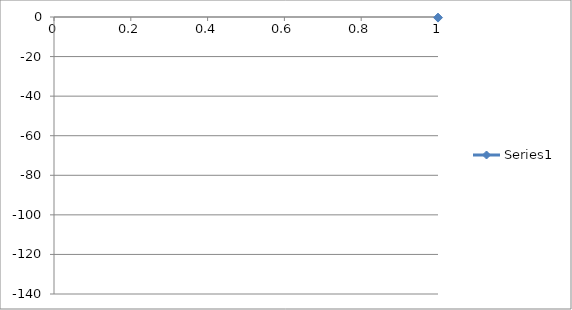
| Category | Series 0 |
|---|---|
| 0 | -0.308 |
| 1 | -0.345 |
| 2 | -0.391 |
| 3 | -0.426 |
| 4 | -0.462 |
| 5 | -0.481 |
| 6 | -0.52 |
| 7 | -0.547 |
| 8 | -0.577 |
| 9 | -0.63 |
| 10 | -0.69 |
| 11 | -0.733 |
| 12 | -0.781 |
| 13 | -0.852 |
| 14 | -0.932 |
| 15 | -1.025 |
| 16 | -1.119 |
| 17 | -1.239 |
| 18 | -1.372 |
| 19 | -1.512 |
| 20 | -1.696 |
| 21 | -1.873 |
| 22 | -2.105 |
| 23 | -2.351 |
| 24 | -2.673 |
| 25 | -3.03 |
| 26 | -3.458 |
| 27 | -4.013 |
| 28 | -4.698 |
| 29 | -6.071 |
| 30 | -6.754 |
| 31 | -7.737 |
| 32 | -8.215 |
| 33 | -8.807 |
| 34 | -9.493 |
| 35 | -10.876 |
| 36 | -11.461 |
| 37 | -13.031 |
| 38 | -14.277 |
| 39 | -15.553 |
| 40 | -17.068 |
| 41 | -18.646 |
| 42 | -20.546 |
| 43 | -22.472 |
| 44 | -25.158 |
| 45 | -27.834 |
| 46 | -30.607 |
| 47 | -33.442 |
| 48 | -36.999 |
| 49 | -40.371 |
| 50 | -44.378 |
| 51 | -48.425 |
| 52 | -52.546 |
| 53 | -56.638 |
| 54 | -61.38 |
| 55 | -65.673 |
| 56 | -69.777 |
| 57 | -74.334 |
| 58 | -78.542 |
| 59 | -82.749 |
| 60 | -86.443 |
| 61 | -90.438 |
| 62 | -93.694 |
| 63 | -96.607 |
| 64 | -99.52 |
| 65 | -102.029 |
| 66 | -103.824 |
| 67 | -105.673 |
| 68 | -107.474 |
| 69 | -108.966 |
| 70 | -110.3 |
| 71 | -110.897 |
| 72 | -111.976 |
| 73 | -112.696 |
| 74 | -113.047 |
| 75 | -113.39 |
| 76 | -113.764 |
| 77 | -113.999 |
| 78 | -114.204 |
| 79 | -114.363 |
| 80 | -114.504 |
| 81 | -114.608 |
| 82 | -114.692 |
| 83 | -114.741 |
| 84 | -114.739 |
| 85 | -114.674 |
| 86 | -114.531 |
| 87 | -114.293 |
| 88 | -113.894 |
| 89 | -113.36 |
| 90 | -112.061 |
| 91 | -111.465 |
| 92 | -109.879 |
| 93 | -108.36 |
| 94 | -106.556 |
| 95 | -104.025 |
| 96 | -101.44 |
| 97 | -98.7 |
| 98 | -95.771 |
| 99 | -92.507 |
| 100 | -88.64 |
| 101 | -84.805 |
| 102 | -80.417 |
| 103 | -76.396 |
| 104 | -71.609 |
| 105 | -67.262 |
| 106 | -62.924 |
| 107 | -58.123 |
| 108 | -53.976 |
| 109 | -49.637 |
| 110 | -45.465 |
| 111 | -41.634 |
| 112 | -38.272 |
| 113 | -34.392 |
| 114 | -31.455 |
| 115 | -28.705 |
| 116 | -25.849 |
| 117 | -23.486 |
| 118 | -21.717 |
| 119 | -19.282 |
| 120 | -17.804 |
| 121 | -16.225 |
| 122 | -14.72 |
| 123 | -13.358 |
| 124 | -12.725 |
| 125 | -11.332 |
| 126 | -10.733 |
| 127 | -9.439 |
| 128 | -9.071 |
| 129 | -8.482 |
| 130 | -7.89 |
| 131 | -6.378 |
| 132 | -5.644 |
| 133 | -4.849 |
| 134 | -4.143 |
| 135 | -3.535 |
| 136 | -2.965 |
| 137 | -2.634 |
| 138 | -2.307 |
| 139 | -2.048 |
| 140 | -1.792 |
| 141 | -1.585 |
| 142 | -1.409 |
| 143 | -1.261 |
| 144 | -1.123 |
| 145 | -1.015 |
| 146 | -0.906 |
| 147 | -0.796 |
| 148 | -0.722 |
| 149 | -0.643 |
| 150 | -0.566 |
| 151 | -0.507 |
| 152 | -0.437 |
| 153 | -0.392 |
| 154 | -0.334 |
| 155 | -0.297 |
| 156 | -0.256 |
| 157 | -0.216 |
| 158 | -0.198 |
| 159 | -0.164 |
| 160 | -0.154 |